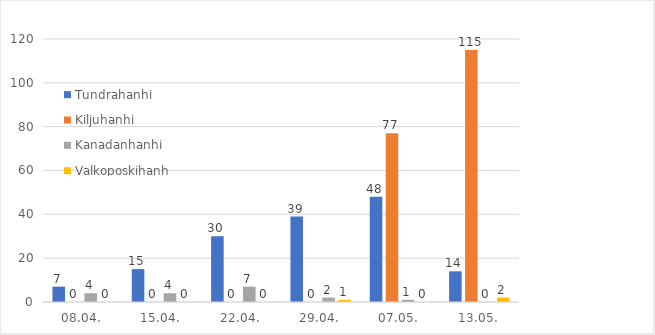
| Category | Tundrahanhi | Kiljuhanhi | Kanadanhanhi | Valkoposkihanhi |
|---|---|---|---|---|
| 08.04. | 7 | 0 | 4 | 0 |
| 15.04. | 15 | 0 | 4 | 0 |
| 22.04. | 30 | 0 | 7 | 0 |
| 29.04. | 39 | 0 | 2 | 1 |
| 07.05. | 48 | 77 | 1 | 0 |
| 13.05. | 14 | 115 | 0 | 2 |